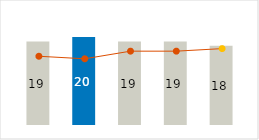
| Category | Fixed Cost |
|---|---|
| 0 | 19 |
| 1 | 20 |
| 2 | 19 |
| 3 | 19 |
| 4 | 18 |